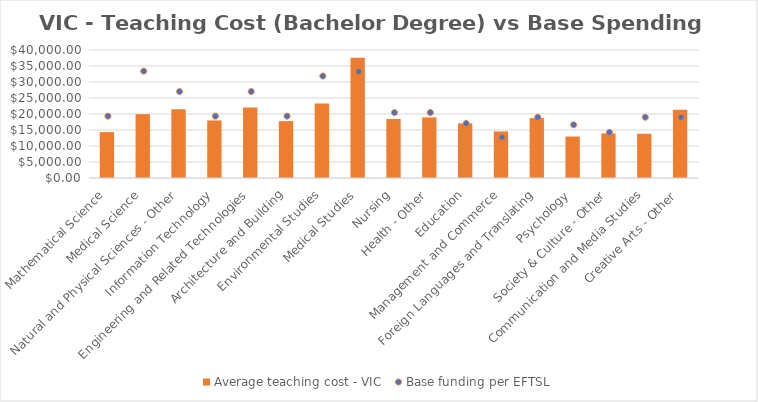
| Category | Average teaching cost - VIC  |
|---|---|
| Mathematical Science | 14340.909 |
| Medical Science | 19953.897 |
| Natural and Physical Sciences - Other | 21484.419 |
| Information Technology | 17993.064 |
| Engineering and Related Technologies | 22044.172 |
| Architecture and Building | 17772.214 |
| Environmental Studies | 23301.021 |
| Medical Studies | 37604.917 |
| Nursing | 18444.014 |
| Health - Other | 18938.507 |
| Education | 17070.423 |
| Management and Commerce | 14552.81 |
| Foreign Languages and Translating | 18728.546 |
| Psychology | 12961.578 |
| Society & Culture - Other | 13932.983 |
| Communication and Media Studies | 13817.098 |
| Creative Arts - Other | 21354.95 |